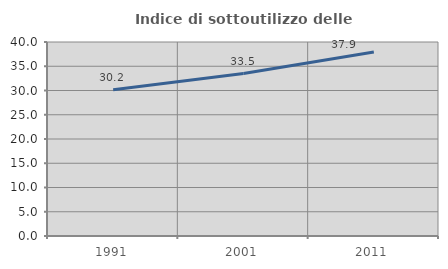
| Category | Indice di sottoutilizzo delle abitazioni  |
|---|---|
| 1991.0 | 30.154 |
| 2001.0 | 33.498 |
| 2011.0 | 37.941 |